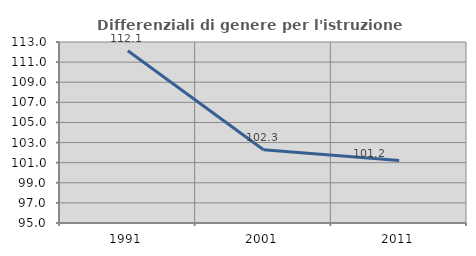
| Category | Differenziali di genere per l'istruzione superiore |
|---|---|
| 1991.0 | 112.128 |
| 2001.0 | 102.285 |
| 2011.0 | 101.21 |